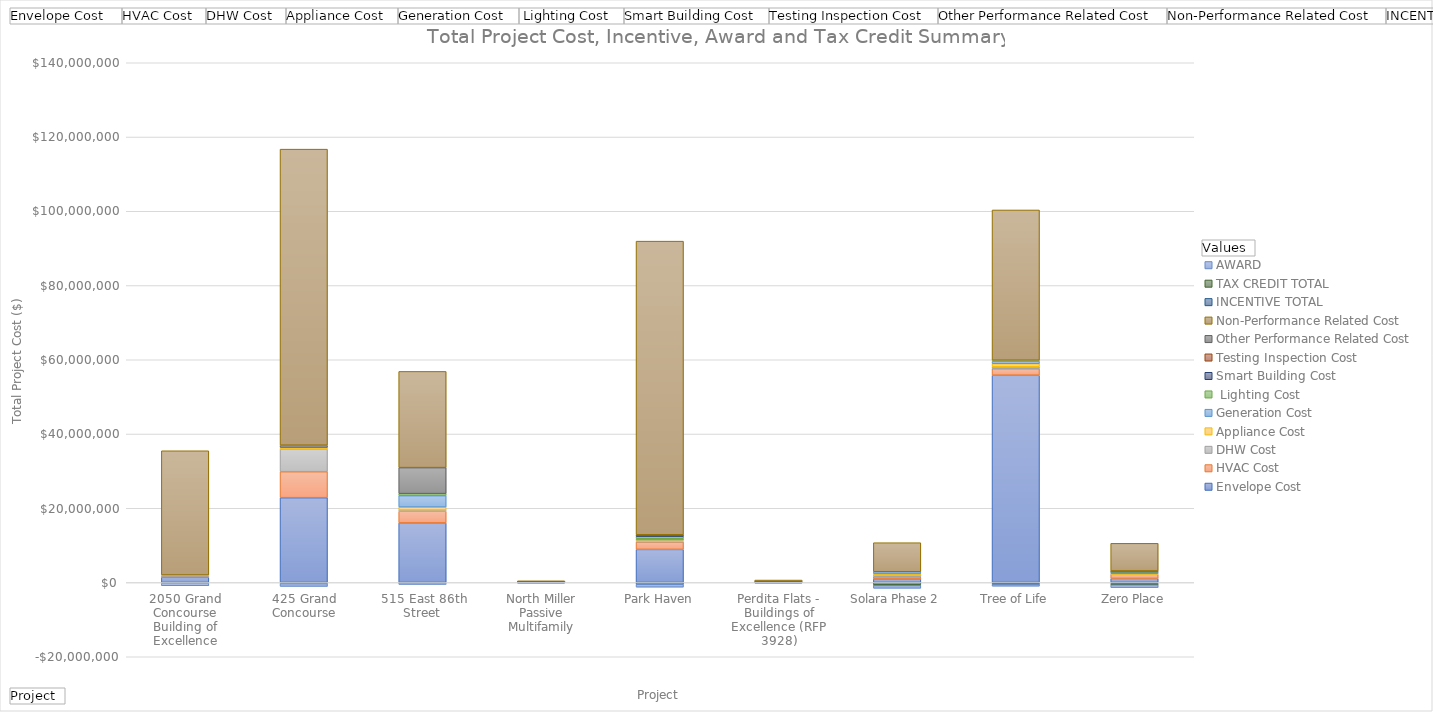
| Category | Envelope Cost   | HVAC Cost  | DHW Cost  | Appliance Cost  | Generation Cost  |  Lighting Cost  | Smart Building Cost  | Testing Inspection Cost  | Other Performance Related Cost  | Non-Performance Related Cost  | INCENTIVE TOTAL  | TAX CREDIT TOTAL  | AWARD  |
|---|---|---|---|---|---|---|---|---|---|---|---|---|---|
| 2050 Grand Concourse Building of Excellence | 1397740 | 278755 | 152904 | 183414 | 0 | 0 | 0 | 0 | 0 | 33471698 | -126920 | 0 | -750000 |
| 425 Grand Concourse | 22845877 | 6998906 | 6106206 | 434701 | 0 | 0 | 0 | 0 | 597000 | 79750501 | -300000 | 0 | -750000 |
| 515 East 86th Street  | 16052777 | 3168000 | 307000 | 788116 | 3072683 | 553272 | 0 | 0 | 7001039.706 | 25917381.706 | -99617.8 | 0 | -425000 |
| North Miller Passive Multifamily | 96977.91 | 8539.65 | 5400 | 7000 | 27815 | 2147.13 | 2300 | 7650 | 5000 | 289777.66 | -12600 | -14255 | -39467 |
| Park Haven | 8918168 | 2028100 | 91500 | 404336 | 339261 | 590723 | 350000 | 45775 | 100000 | 79083917 | -508200 | 0 | -750000 |
| Perdita Flats - Buildings of Excellence (RFP 3928) | 64925.8 | 30000 | 12400 | 21000 | 34600 | 750 | 0 | 0 | 0 | 500484.2 | -6400 | -14933 | -59976 |
| Solara Phase 2 | 956923 | 575523 | 498000 | 299400 | 558000 | 0 | 0 | 0 | 0 | 7833460 | -545927.81 | -266760 | -750000 |
| Tree of Life | 55841481.68 | 1750000 | 500000 | 847000 | 632357 | 300000 | 0 | 0 | 0 | 40475383.71 | -320000 | -185526 | -500000 |
| Zero Place | 1101500 | 1100000 | 50000 | 110630 | 475000 | 10000 | 215000 | 45000 | 0 | 7440183 | -315040 | -313400 | -750000 |